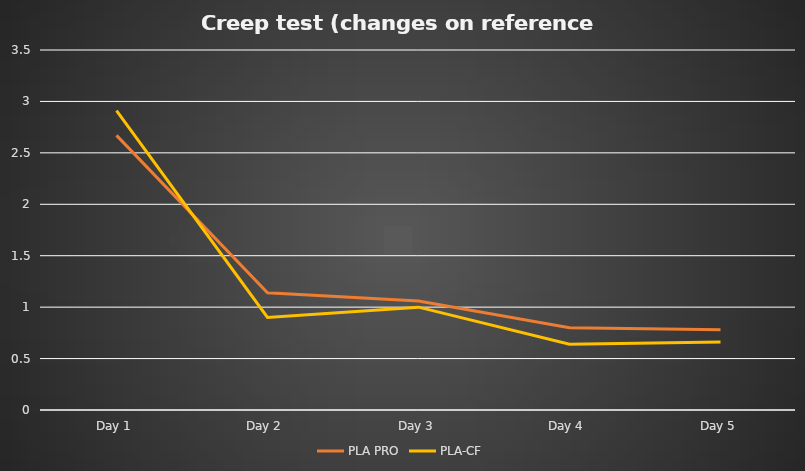
| Category | PLA PRO | PLA-CF |
|---|---|---|
| Day 1 | 2.67 | 2.91 |
| Day 2 | 1.14 | 0.9 |
| Day 3 | 1.06 | 1 |
| Day 4 | 0.8 | 0.64 |
| Day 5 | 0.78 | 0.66 |